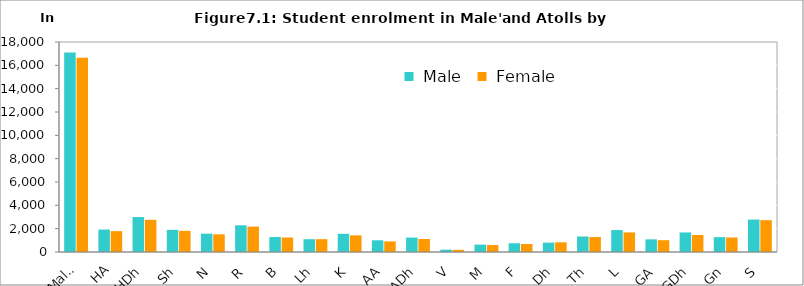
| Category |  Male |  Female |
|---|---|---|
| Male' | 17107 | 16650 |
|  HA | 1925 | 1788 |
|  HDh | 2995 | 2759 |
|  Sh | 1897 | 1817 |
|  N | 1571 | 1514 |
|  R | 2289 | 2177 |
| B | 1282 | 1239 |
| Lh | 1097 | 1101 |
| K | 1558 | 1425 |
| AA | 1006 | 908 |
| ADh | 1233 | 1114 |
| V | 199 | 184 |
| M | 635 | 597 |
| F | 749 | 688 |
| Dh | 803 | 832 |
| Th | 1327 | 1287 |
|  L | 1880 | 1679 |
| GA | 1084 | 1012 |
| GDh | 1676 | 1456 |
| Gn | 1272 | 1244 |
| S | 2780 | 2729 |